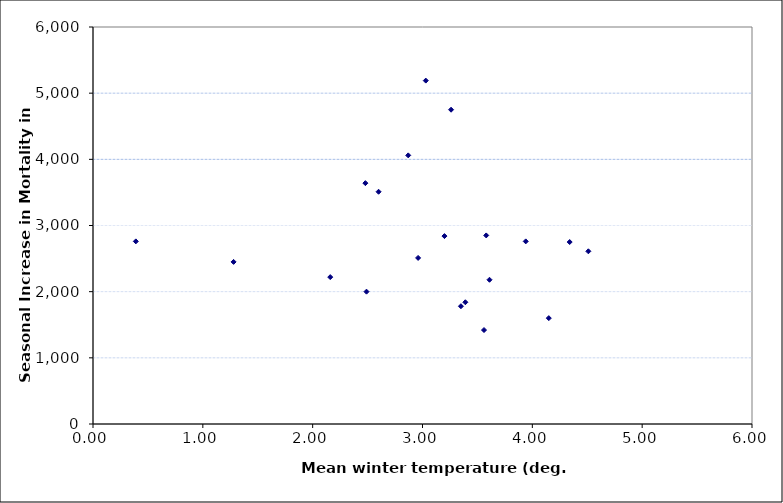
| Category | Seas Incr. Mort. |
|---|---|
| 2.48 | 3640 |
| 4.51 | 2610 |
| 3.26 | 4750 |
| 3.03 | 5190 |
| 2.16 | 2220 |
| 3.39 | 1840 |
| 2.96 | 2510 |
| 3.2 | 2840 |
| 3.94 | 2760 |
| 3.35 | 1780 |
| 4.34 | 2750 |
| 3.61 | 2180 |
| 2.6 | 3510 |
| 0.39 | 2760 |
| 1.28 | 2450 |
| 3.56 | 1420 |
| 2.49 | 2000 |
| 4.15 | 1600 |
| 2.87 | 4060 |
| 3.58 | 2850 |